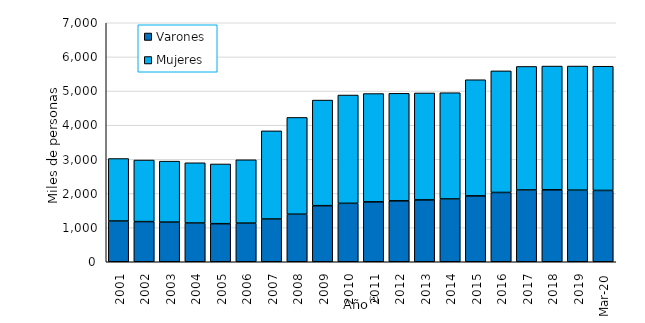
| Category | Varones | Mujeres |
|---|---|---|
| 2001.0 | 1193369 | 1829825 |
| 2002.0 | 1175989 | 1803977 |
| 2003.0 | 1161239 | 1785766 |
| 2004.0 | 1134869 | 1764005 |
| 2005.0 | 1115120 | 1749062 |
| 2006.0 | 1131393 | 1855504 |
| 2007.0 | 1252163 | 2581424 |
| 2008.0 | 1392284 | 2835170 |
| 2009.0 | 1642266 | 3093266 |
| 2010.0 | 1711844 | 3171536 |
| 2011.0 | 1754921 | 3171583 |
| 2012.0 | 1785047 | 3148319 |
| 2013.0 | 1812485 | 3130617 |
| 2014.0 | 1840009 | 3111015 |
| 2015.0 | 1929806 | 3401281 |
| 2016.0 | 2029585 | 3561014 |
| 2017.0 | 2103123 | 3617499 |
| 2018.0 | 2106528 | 3625108 |
| 2019.0 | 2096782 | 3635178 |
| 43891.0 | 2088905 | 3637872 |